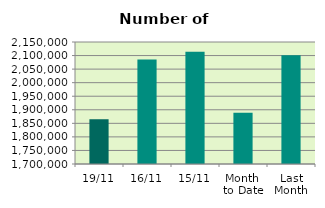
| Category | Series 0 |
|---|---|
| 19/11 | 1865088 |
| 16/11 | 2085832 |
| 15/11 | 2114408 |
| Month 
to Date | 1888710.769 |
| Last
Month | 2101052.87 |